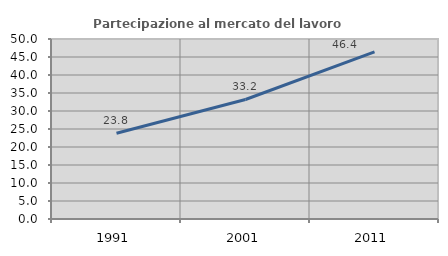
| Category | Partecipazione al mercato del lavoro  femminile |
|---|---|
| 1991.0 | 23.834 |
| 2001.0 | 33.197 |
| 2011.0 | 46.417 |